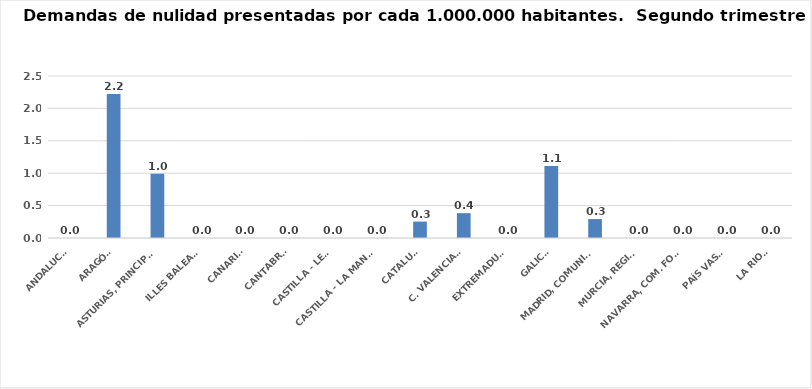
| Category | Series 0 |
|---|---|
| ANDALUCÍA | 0 |
| ARAGÓN | 2.223 |
| ASTURIAS, PRINCIPADO | 0.993 |
| ILLES BALEARS | 0 |
| CANARIAS | 0 |
| CANTABRIA | 0 |
| CASTILLA - LEÓN | 0 |
| CASTILLA - LA MANCHA | 0 |
| CATALUÑA | 0.253 |
| C. VALENCIANA | 0.383 |
| EXTREMADURA | 0 |
| GALICIA | 1.111 |
| MADRID, COMUNIDAD | 0.292 |
| MURCIA, REGIÓN | 0 |
| NAVARRA, COM. FORAL | 0 |
| PAÍS VASCO | 0 |
| LA RIOJA | 0 |